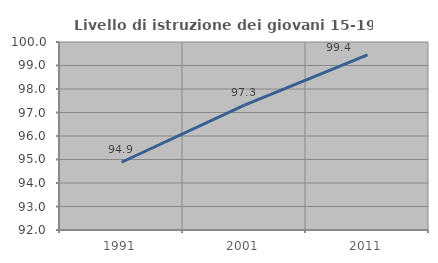
| Category | Livello di istruzione dei giovani 15-19 anni |
|---|---|
| 1991.0 | 94.883 |
| 2001.0 | 97.313 |
| 2011.0 | 99.449 |